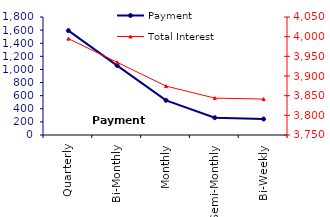
| Category | Payment |
|---|---|
| Quarterly | 1591.8 |
| Bi-Monthly | 1059.19 |
| Monthly | 528.59 |
| Semi-Monthly | 264.04 |
| Bi-Weekly | 243.71 |